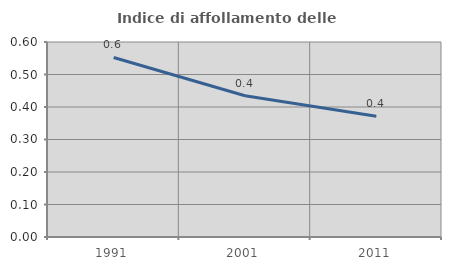
| Category | Indice di affollamento delle abitazioni  |
|---|---|
| 1991.0 | 0.552 |
| 2001.0 | 0.435 |
| 2011.0 | 0.372 |